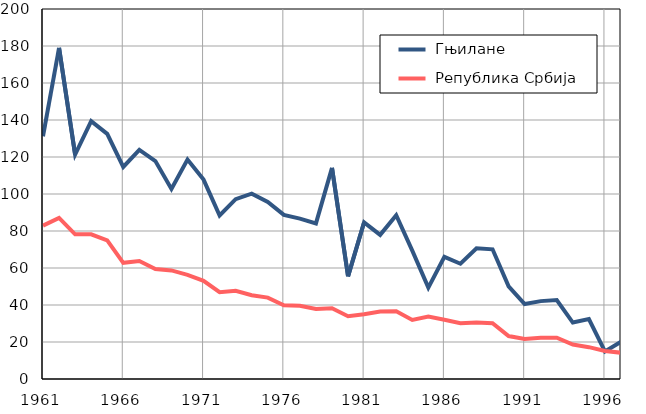
| Category |  Гњилане |  Република Србија |
|---|---|---|
| 1961.0 | 131.2 | 82.9 |
| 1962.0 | 179 | 87.1 |
| 1963.0 | 121.3 | 78.2 |
| 1964.0 | 139.4 | 78.2 |
| 1965.0 | 132.5 | 74.9 |
| 1966.0 | 114.6 | 62.8 |
| 1967.0 | 123.8 | 63.8 |
| 1968.0 | 117.8 | 59.4 |
| 1969.0 | 102.7 | 58.7 |
| 1970.0 | 118.6 | 56.3 |
| 1971.0 | 107.8 | 53.1 |
| 1972.0 | 88.4 | 46.9 |
| 1973.0 | 97.2 | 47.7 |
| 1974.0 | 100.2 | 45.3 |
| 1975.0 | 95.7 | 44 |
| 1976.0 | 88.7 | 39.9 |
| 1977.0 | 86.7 | 39.6 |
| 1978.0 | 84.1 | 37.8 |
| 1979.0 | 114.1 | 38.2 |
| 1980.0 | 55.5 | 33.9 |
| 1981.0 | 84.7 | 35 |
| 1982.0 | 77.9 | 36.5 |
| 1983.0 | 88.5 | 36.6 |
| 1984.0 | 69.4 | 31.9 |
| 1985.0 | 49.4 | 33.7 |
| 1986.0 | 66 | 32 |
| 1987.0 | 62.3 | 30.2 |
| 1988.0 | 70.7 | 30.5 |
| 1989.0 | 70.1 | 30.2 |
| 1990.0 | 50.1 | 23.2 |
| 1991.0 | 40.5 | 21.6 |
| 1992.0 | 42.1 | 22.3 |
| 1993.0 | 42.7 | 22.3 |
| 1994.0 | 30.5 | 18.6 |
| 1995.0 | 32.4 | 17.2 |
| 1996.0 | 14.9 | 15.1 |
| 1997.0 | 20.1 | 14.2 |